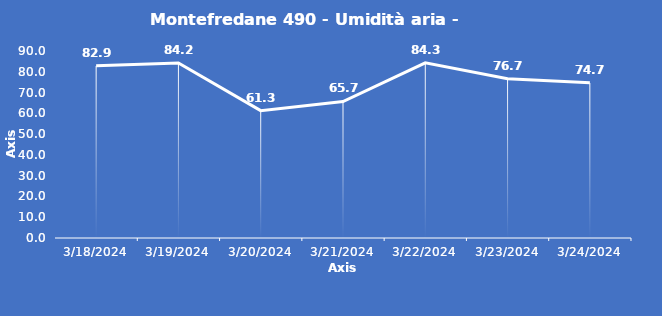
| Category | Montefredane 490 - Umidità aria - Grezzo (%) |
|---|---|
| 3/18/24 | 82.9 |
| 3/19/24 | 84.2 |
| 3/20/24 | 61.3 |
| 3/21/24 | 65.7 |
| 3/22/24 | 84.3 |
| 3/23/24 | 76.7 |
| 3/24/24 | 74.7 |